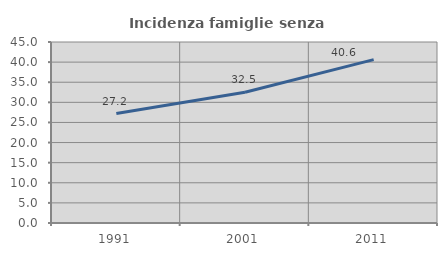
| Category | Incidenza famiglie senza nuclei |
|---|---|
| 1991.0 | 27.215 |
| 2001.0 | 32.5 |
| 2011.0 | 40.625 |